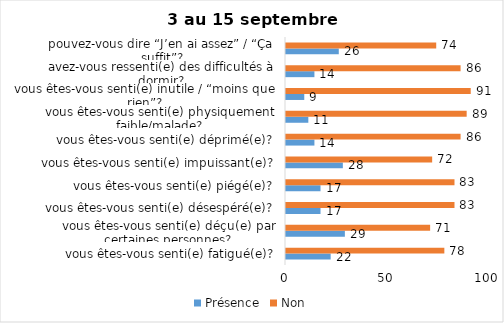
| Category | Présence | Non |
|---|---|---|
| vous êtes-vous senti(e) fatigué(e)? | 22 | 78 |
| vous êtes-vous senti(e) déçu(e) par certaines personnes? | 29 | 71 |
| vous êtes-vous senti(e) désespéré(e)? | 17 | 83 |
| vous êtes-vous senti(e) piégé(e)? | 17 | 83 |
| vous êtes-vous senti(e) impuissant(e)? | 28 | 72 |
| vous êtes-vous senti(e) déprimé(e)? | 14 | 86 |
| vous êtes-vous senti(e) physiquement faible/malade? | 11 | 89 |
| vous êtes-vous senti(e) inutile / “moins que rien”? | 9 | 91 |
| avez-vous ressenti(e) des difficultés à dormir? | 14 | 86 |
| pouvez-vous dire “J’en ai assez” / “Ça suffit”? | 26 | 74 |